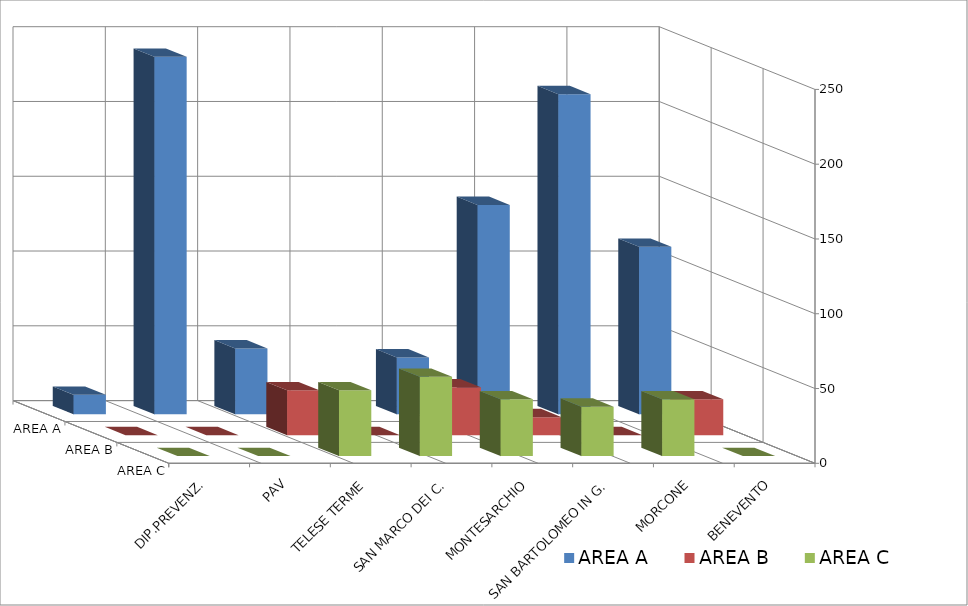
| Category | AREA A | AREA B | AREA C |
|---|---|---|---|
| BENEVENTO | 112 | 24 | 0 |
| MORCONE | 214 | 0 | 38 |
| SAN BARTOLOMEO IN G. | 140 | 12 | 33 |
| MONTESARCHIO | 38 | 32 | 38 |
| SAN MARCO DEI C. | 0 | 0 | 53 |
| TELESE TERME | 44 | 30 | 44 |
| PAV | 239 | 0 | 0 |
| DIP.PREVENZ. | 13 | 0 | 0 |